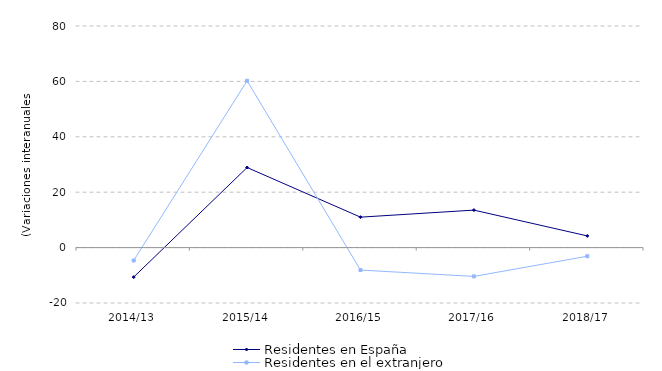
| Category | Residentes en España | Residentes en el extranjero |
|---|---|---|
| 2014/13 | -10.647 | -4.652 |
| 2015/14 | 28.911 | 60.209 |
| 2016/15 | 10.995 | -8.107 |
| 2017/16 | 13.532 | -10.402 |
| 2018/17 | 4.217 | -3.113 |